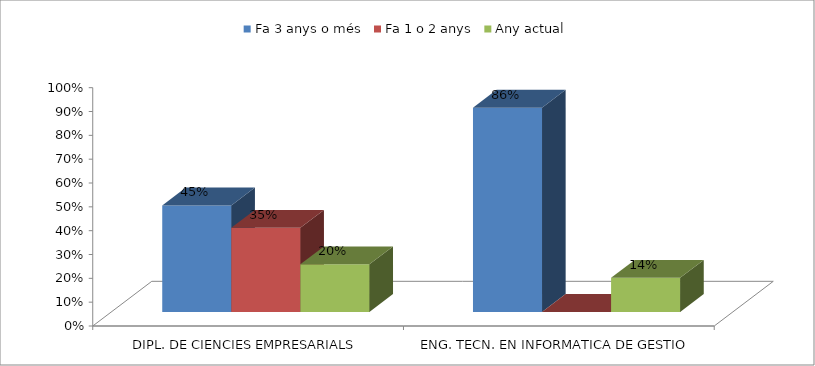
| Category | Fa 3 anys o més | Fa 1 o 2 anys | Any actual |
|---|---|---|---|
| DIPL. DE CIENCIES EMPRESARIALS | 0.447 | 0.353 | 0.2 |
| ENG. TECN. EN INFORMATICA DE GESTIO | 0.857 | 0 | 0.143 |